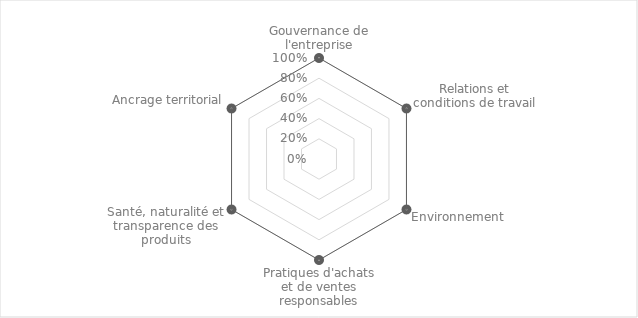
| Category | Series 0 |
|---|---|
| Gouvernance de l'entreprise | 1 |
| Relations et conditions de travail | 1 |
| Environnement | 1 |
| Pratiques d'achats et de ventes responsables | 1 |
| Santé, naturalité et transparence des produits | 1 |
| Ancrage territorial | 1 |